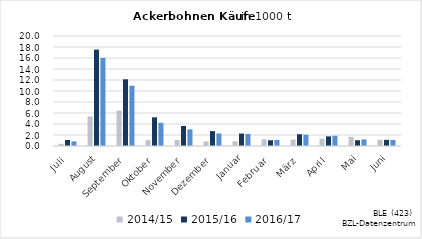
| Category | 2014/15 | 2015/16 | 2016/17 |
|---|---|---|---|
| Juli | 0.398 | 1.093 | 0.836 |
| August | 5.388 | 17.524 | 16.018 |
| September | 6.447 | 12.131 | 10.952 |
| Oktober | 1.062 | 5.21 | 4.213 |
| November | 1.088 | 3.641 | 3.023 |
| Dezember | 0.829 | 2.707 | 2.277 |
| Januar | 0.855 | 2.263 | 2.194 |
| Februar | 1.213 | 1.041 | 1.104 |
| März | 1.167 | 2.136 | 2.056 |
| April | 1.314 | 1.753 | 1.861 |
| Mai | 1.674 | 1.049 | 1.203 |
| Juni | 1.13 | 1.117 | 1.087 |